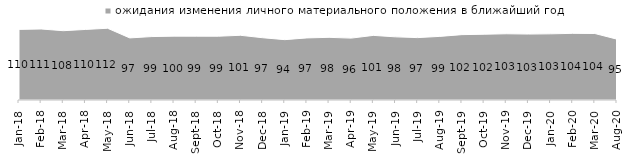
| Category | ожидания изменения личного материального положения в ближайший год |
|---|---|
| 2018-01-01 | 110.05 |
| 2018-02-01 | 110.65 |
| 2018-03-01 | 108 |
| 2018-04-01 | 109.95 |
| 2018-05-01 | 111.8 |
| 2018-06-01 | 96.75 |
| 2018-07-01 | 98.85 |
| 2018-08-01 | 99.5 |
| 2018-09-01 | 99.45 |
| 2018-10-01 | 99.4 |
| 2018-11-01 | 100.848 |
| 2018-12-01 | 97.05 |
| 2019-01-01 | 94.05 |
| 2019-02-01 | 96.75 |
| 2019-03-01 | 97.663 |
| 2019-04-01 | 96.436 |
| 2019-05-01 | 100.693 |
| 2019-06-01 | 98.404 |
| 2019-07-01 | 97.228 |
| 2019-08-01 | 99.151 |
| 2019-09-01 | 101.881 |
| 2019-10-01 | 102.475 |
| 2019-11-01 | 103.218 |
| 2019-12-01 | 102.772 |
| 2020-01-01 | 103.119 |
| 2020-02-01 | 103.861 |
| 2020-03-01 | 103.619 |
| 2020-08-01 | 94.786 |